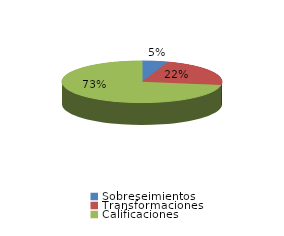
| Category | Series 0 |
|---|---|
| Sobreseimientos | 84 |
| Transformaciones | 360 |
| Calificaciones | 1171 |